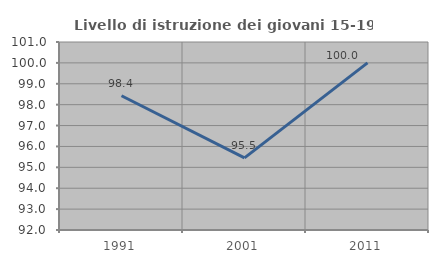
| Category | Livello di istruzione dei giovani 15-19 anni |
|---|---|
| 1991.0 | 98.425 |
| 2001.0 | 95.455 |
| 2011.0 | 100 |